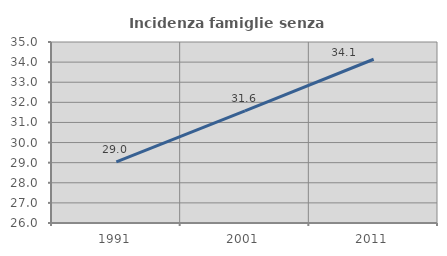
| Category | Incidenza famiglie senza nuclei |
|---|---|
| 1991.0 | 29.04 |
| 2001.0 | 31.578 |
| 2011.0 | 34.142 |